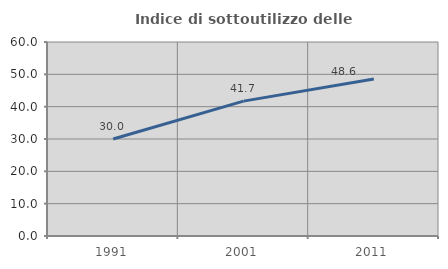
| Category | Indice di sottoutilizzo delle abitazioni  |
|---|---|
| 1991.0 | 30 |
| 2001.0 | 41.714 |
| 2011.0 | 48.571 |